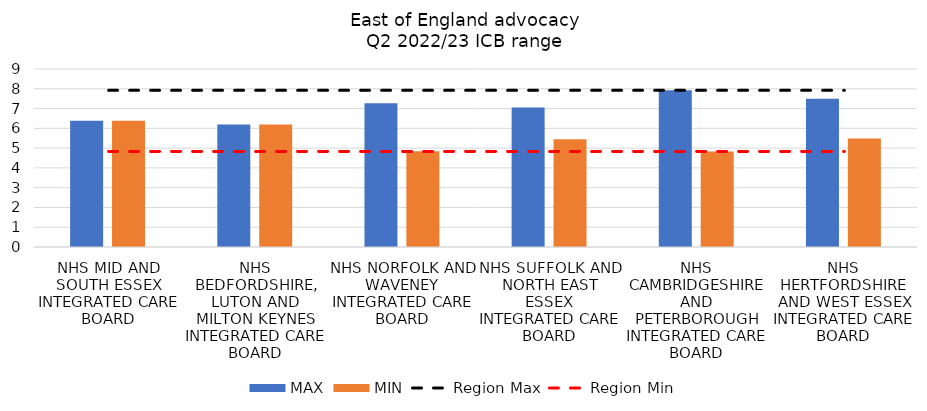
| Category | MAX | MIN |
|---|---|---|
| NHS MID AND SOUTH ESSEX INTEGRATED CARE BOARD | 6.388 | 6.388 |
| NHS BEDFORDSHIRE, LUTON AND MILTON KEYNES INTEGRATED CARE BOARD | 6.188 | 6.188 |
| NHS NORFOLK AND WAVENEY INTEGRATED CARE BOARD | 7.264 | 4.843 |
| NHS SUFFOLK AND NORTH EAST ESSEX INTEGRATED CARE BOARD | 7.055 | 5.443 |
| NHS CAMBRIDGESHIRE AND PETERBOROUGH INTEGRATED CARE BOARD | 7.921 | 4.83 |
| NHS HERTFORDSHIRE AND WEST ESSEX INTEGRATED CARE BOARD | 7.495 | 5.487 |